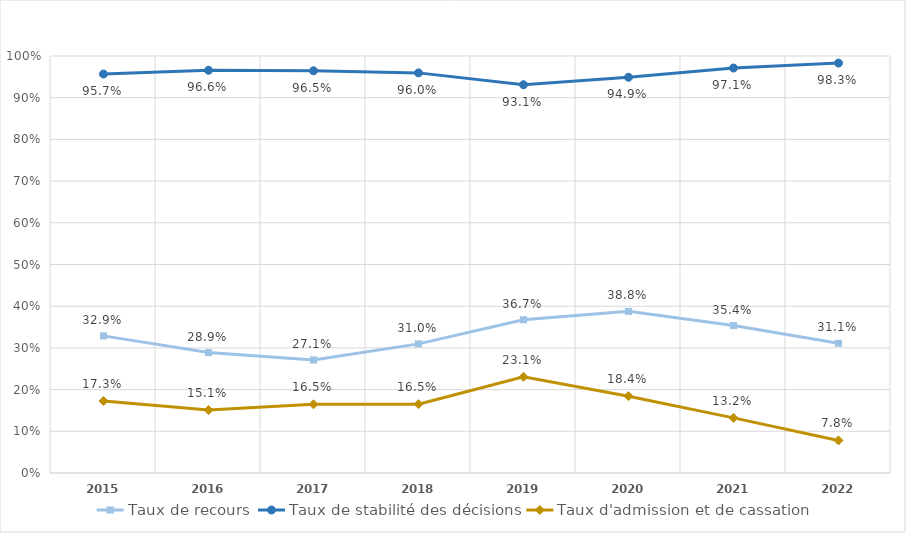
| Category | Taux de recours | Taux de stabilité des décisions | Taux d'admission et de cassation |
|---|---|---|---|
| 2015.0 | 0.329 | 0.957 | 0.173 |
| 2016.0 | 0.289 | 0.966 | 0.151 |
| 2017.0 | 0.271 | 0.965 | 0.165 |
| 2018.0 | 0.31 | 0.96 | 0.165 |
| 2019.0 | 0.367 | 0.931 | 0.231 |
| 2020.0 | 0.388 | 0.949 | 0.184 |
| 2021.0 | 0.354 | 0.971 | 0.132 |
| 2022.0 | 0.311 | 0.983 | 0.078 |